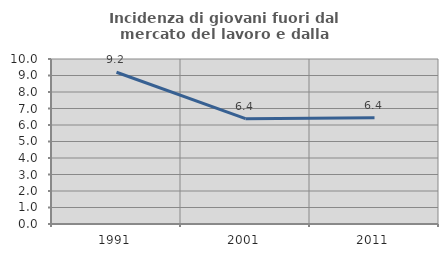
| Category | Incidenza di giovani fuori dal mercato del lavoro e dalla formazione  |
|---|---|
| 1991.0 | 9.196 |
| 2001.0 | 6.386 |
| 2011.0 | 6.446 |